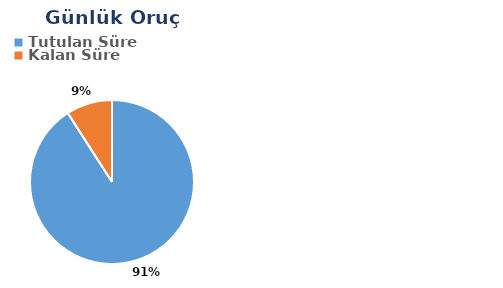
| Category | Günlük |
|---|---|
| Tutulan Süre | 0.527 |
| Kalan Süre | 0.053 |